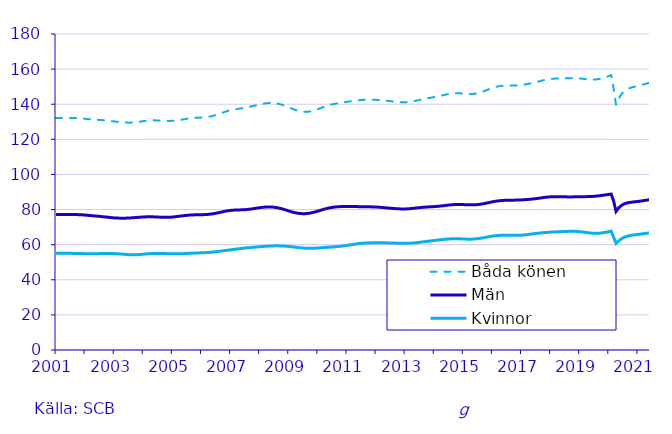
| Category | Båda könen | Män | Kvinnor |
|---|---|---|---|
| 2001.0 | 132.22 | 77.18 | 55.04 |
| nan | 132.19 | 77.15 | 55.04 |
| nan | 132.19 | 77.15 | 55.05 |
| nan | 132.18 | 77.14 | 55.04 |
| nan | 132.18 | 77.13 | 55.04 |
| nan | 132.17 | 77.13 | 55.04 |
| nan | 132.2 | 77.15 | 55.05 |
| nan | 132.19 | 77.15 | 55.03 |
| nan | 132.15 | 77.14 | 55.01 |
| nan | 132.08 | 77.11 | 54.98 |
| nan | 131.99 | 77.05 | 54.94 |
| nan | 131.87 | 76.97 | 54.91 |
| nan | 131.73 | 76.86 | 54.87 |
| nan | 131.58 | 76.73 | 54.85 |
| nan | 131.45 | 76.61 | 54.84 |
| nan | 131.32 | 76.48 | 54.84 |
| nan | 131.22 | 76.36 | 54.86 |
| nan | 131.12 | 76.23 | 54.88 |
| nan | 131.02 | 76.1 | 54.92 |
| nan | 130.93 | 75.97 | 54.96 |
| nan | 130.82 | 75.82 | 55 |
| nan | 130.7 | 75.67 | 55.02 |
| nan | 130.54 | 75.52 | 55.02 |
| nan | 130.37 | 75.38 | 54.99 |
| 2003.0 | 130.19 | 75.26 | 54.93 |
| nan | 130.02 | 75.16 | 54.85 |
| nan | 129.86 | 75.11 | 54.75 |
| nan | 129.73 | 75.08 | 54.64 |
| nan | 129.61 | 75.09 | 54.53 |
| nan | 129.54 | 75.12 | 54.41 |
| nan | 129.5 | 75.18 | 54.32 |
| nan | 129.53 | 75.26 | 54.26 |
| nan | 129.61 | 75.36 | 54.25 |
| nan | 129.75 | 75.47 | 54.28 |
| nan | 129.93 | 75.58 | 54.35 |
| nan | 130.13 | 75.68 | 54.45 |
| nan | 130.35 | 75.77 | 54.57 |
| nan | 130.54 | 75.84 | 54.69 |
| nan | 130.68 | 75.88 | 54.8 |
| nan | 130.77 | 75.88 | 54.89 |
| nan | 130.81 | 75.85 | 54.95 |
| nan | 130.8 | 75.8 | 55 |
| nan | 130.74 | 75.73 | 55.01 |
| nan | 130.66 | 75.66 | 54.99 |
| nan | 130.56 | 75.6 | 54.97 |
| nan | 130.48 | 75.56 | 54.93 |
| nan | 130.45 | 75.56 | 54.88 |
| nan | 130.46 | 75.62 | 54.85 |
| 2005.0 | 130.54 | 75.72 | 54.81 |
| nan | 130.66 | 75.87 | 54.8 |
| nan | 130.83 | 76.04 | 54.79 |
| nan | 131.03 | 76.22 | 54.81 |
| nan | 131.25 | 76.4 | 54.85 |
| nan | 131.48 | 76.57 | 54.91 |
| nan | 131.71 | 76.72 | 54.99 |
| nan | 131.91 | 76.84 | 55.07 |
| nan | 132.06 | 76.93 | 55.14 |
| nan | 132.18 | 76.98 | 55.2 |
| nan | 132.27 | 77.02 | 55.26 |
| nan | 132.35 | 77.04 | 55.31 |
| nan | 132.43 | 77.07 | 55.36 |
| nan | 132.53 | 77.11 | 55.42 |
| nan | 132.67 | 77.18 | 55.49 |
| nan | 132.87 | 77.29 | 55.58 |
| nan | 133.14 | 77.44 | 55.69 |
| nan | 133.48 | 77.65 | 55.83 |
| nan | 133.89 | 77.91 | 55.98 |
| nan | 134.36 | 78.2 | 56.16 |
| nan | 134.85 | 78.5 | 56.34 |
| nan | 135.34 | 78.81 | 56.53 |
| nan | 135.8 | 79.1 | 56.71 |
| nan | 136.22 | 79.34 | 56.88 |
| 2007.0 | 136.57 | 79.52 | 57.05 |
| nan | 136.87 | 79.64 | 57.23 |
| nan | 137.13 | 79.72 | 57.41 |
| nan | 137.36 | 79.77 | 57.59 |
| nan | 137.57 | 79.81 | 57.76 |
| nan | 137.79 | 79.86 | 57.93 |
| nan | 138.02 | 79.94 | 58.08 |
| nan | 138.27 | 80.06 | 58.22 |
| nan | 138.56 | 80.22 | 58.34 |
| nan | 138.88 | 80.41 | 58.47 |
| nan | 139.22 | 80.63 | 58.59 |
| nan | 139.56 | 80.86 | 58.71 |
| nan | 139.88 | 81.06 | 58.82 |
| nan | 140.16 | 81.24 | 58.93 |
| nan | 140.41 | 81.38 | 59.03 |
| nan | 140.6 | 81.47 | 59.13 |
| nan | 140.71 | 81.5 | 59.21 |
| nan | 140.72 | 81.45 | 59.27 |
| nan | 140.63 | 81.32 | 59.31 |
| nan | 140.44 | 81.11 | 59.32 |
| nan | 140.15 | 80.83 | 59.31 |
| nan | 139.76 | 80.49 | 59.27 |
| nan | 139.3 | 80.09 | 59.21 |
| nan | 138.77 | 79.66 | 59.12 |
| 2009.0 | 138.22 | 79.22 | 59 |
| nan | 137.65 | 78.79 | 58.86 |
| nan | 137.11 | 78.41 | 58.7 |
| nan | 136.61 | 78.09 | 58.52 |
| nan | 136.2 | 77.85 | 58.34 |
| nan | 135.89 | 77.71 | 58.19 |
| nan | 135.71 | 77.65 | 58.06 |
| nan | 135.65 | 77.68 | 57.96 |
| nan | 135.73 | 77.81 | 57.91 |
| nan | 135.94 | 78.03 | 57.91 |
| nan | 136.27 | 78.33 | 57.94 |
| nan | 136.69 | 78.69 | 58.01 |
| nan | 137.19 | 79.1 | 58.1 |
| nan | 137.73 | 79.53 | 58.2 |
| nan | 138.27 | 79.96 | 58.31 |
| nan | 138.77 | 80.35 | 58.42 |
| nan | 139.23 | 80.71 | 58.52 |
| nan | 139.62 | 81 | 58.62 |
| nan | 139.95 | 81.24 | 58.71 |
| nan | 140.24 | 81.43 | 58.81 |
| nan | 140.49 | 81.57 | 58.92 |
| nan | 140.71 | 81.66 | 59.05 |
| nan | 140.93 | 81.72 | 59.21 |
| nan | 141.14 | 81.74 | 59.4 |
| 2011.0 | 141.35 | 81.75 | 59.6 |
| nan | 141.55 | 81.74 | 59.81 |
| nan | 141.75 | 81.72 | 60.03 |
| nan | 141.95 | 81.7 | 60.25 |
| nan | 142.13 | 81.68 | 60.45 |
| nan | 142.29 | 81.66 | 60.63 |
| nan | 142.41 | 81.63 | 60.77 |
| nan | 142.5 | 81.61 | 60.88 |
| nan | 142.55 | 81.59 | 60.96 |
| nan | 142.58 | 81.56 | 61.01 |
| nan | 142.57 | 81.53 | 61.04 |
| nan | 142.53 | 81.48 | 61.06 |
| nan | 142.5 | 81.44 | 61.05 |
| nan | 142.41 | 81.35 | 61.06 |
| nan | 142.3 | 81.24 | 61.06 |
| nan | 142.17 | 81.12 | 61.05 |
| nan | 142.03 | 80.99 | 61.04 |
| nan | 141.88 | 80.87 | 61.01 |
| nan | 141.73 | 80.75 | 60.98 |
| nan | 141.57 | 80.64 | 60.94 |
| nan | 141.42 | 80.53 | 60.9 |
| nan | 141.3 | 80.44 | 60.86 |
| nan | 141.19 | 80.37 | 60.82 |
| nan | 141.13 | 80.33 | 60.8 |
| 2013.0 | 141.13 | 80.34 | 60.79 |
| nan | 141.21 | 80.41 | 60.8 |
| nan | 141.37 | 80.52 | 60.85 |
| nan | 141.58 | 80.65 | 60.93 |
| nan | 141.84 | 80.8 | 61.04 |
| nan | 142.14 | 80.96 | 61.18 |
| nan | 142.45 | 81.11 | 61.34 |
| nan | 142.75 | 81.24 | 61.51 |
| nan | 143.04 | 81.35 | 61.69 |
| nan | 143.31 | 81.45 | 61.86 |
| nan | 143.57 | 81.54 | 62.03 |
| nan | 143.82 | 81.61 | 62.21 |
| nan | 144.07 | 81.69 | 62.38 |
| nan | 144.33 | 81.78 | 62.55 |
| nan | 144.61 | 81.9 | 62.71 |
| nan | 144.91 | 82.05 | 62.86 |
| nan | 145.22 | 82.21 | 63.01 |
| nan | 145.53 | 82.39 | 63.14 |
| nan | 145.81 | 82.56 | 63.26 |
| nan | 146.05 | 82.7 | 63.35 |
| nan | 146.21 | 82.81 | 63.4 |
| nan | 146.28 | 82.87 | 63.41 |
| nan | 146.26 | 82.89 | 63.37 |
| nan | 146.19 | 82.87 | 63.32 |
| 2015.0 | 146.08 | 82.83 | 63.25 |
| nan | 145.96 | 82.77 | 63.18 |
| nan | 145.86 | 82.72 | 63.14 |
| nan | 145.82 | 82.69 | 63.14 |
| nan | 145.88 | 82.69 | 63.19 |
| nan | 146.04 | 82.74 | 63.29 |
| nan | 146.29 | 82.85 | 63.45 |
| nan | 146.65 | 83.01 | 63.64 |
| nan | 147.12 | 83.24 | 63.88 |
| nan | 147.65 | 83.52 | 64.14 |
| nan | 148.22 | 83.82 | 64.4 |
| nan | 148.77 | 84.12 | 64.65 |
| nan | 149.28 | 84.4 | 64.87 |
| nan | 149.71 | 84.65 | 65.06 |
| nan | 150.06 | 84.87 | 65.19 |
| nan | 150.31 | 85.03 | 65.29 |
| nan | 150.49 | 85.15 | 65.34 |
| nan | 150.6 | 85.24 | 65.36 |
| nan | 150.64 | 85.29 | 65.36 |
| nan | 150.66 | 85.32 | 65.34 |
| nan | 150.66 | 85.34 | 65.32 |
| nan | 150.67 | 85.36 | 65.31 |
| nan | 150.72 | 85.4 | 65.32 |
| nan | 150.81 | 85.45 | 65.36 |
| 2017.0 | 150.94 | 85.51 | 65.43 |
| nan | 151.13 | 85.59 | 65.54 |
| nan | 151.38 | 85.69 | 65.69 |
| nan | 151.66 | 85.8 | 65.86 |
| nan | 151.96 | 85.92 | 66.04 |
| nan | 152.27 | 86.06 | 66.21 |
| nan | 152.6 | 86.23 | 66.38 |
| nan | 152.95 | 86.42 | 66.53 |
| nan | 153.3 | 86.62 | 66.68 |
| nan | 153.64 | 86.83 | 66.81 |
| nan | 153.94 | 87.01 | 66.93 |
| nan | 154.2 | 87.15 | 67.05 |
| nan | 154.4 | 87.26 | 67.14 |
| nan | 154.52 | 87.31 | 67.21 |
| nan | 154.6 | 87.33 | 67.28 |
| nan | 154.65 | 87.31 | 67.34 |
| nan | 154.68 | 87.29 | 67.4 |
| nan | 154.71 | 87.26 | 67.45 |
| nan | 154.74 | 87.23 | 67.51 |
| nan | 154.77 | 87.22 | 67.56 |
| nan | 154.8 | 87.21 | 67.59 |
| nan | 154.82 | 87.22 | 67.6 |
| nan | 154.81 | 87.23 | 67.58 |
| nan | 154.75 | 87.24 | 67.51 |
| 2019.0 | 154.67 | 87.26 | 67.4 |
| nan | 154.55 | 87.29 | 67.26 |
| nan | 154.41 | 87.33 | 67.08 |
| nan | 154.27 | 87.37 | 66.89 |
| nan | 154.13 | 87.42 | 66.71 |
| nan | 154.04 | 87.47 | 66.57 |
| nan | 154.05 | 87.56 | 66.49 |
| nan | 154.16 | 87.68 | 66.47 |
| nan | 154.38 | 87.84 | 66.53 |
| nan | 154.69 | 88.02 | 66.67 |
| nan | 155.09 | 88.22 | 66.87 |
| nan | 155.55 | 88.43 | 67.12 |
| nan | 156.05 | 88.64 | 67.41 |
| nan | 156.55 | 88.82 | 67.73 |
| nan | 149 | 84.84 | 64.17 |
| nan | 139.67 | 78.95 | 60.72 |
| nan | 142.95 | 80.83 | 62.12 |
| nan | 145.28 | 82.12 | 63.16 |
| nan | 146.92 | 82.99 | 63.93 |
| nan | 148.05 | 83.55 | 64.5 |
| nan | 148.83 | 83.9 | 64.93 |
| nan | 149.38 | 84.13 | 65.24 |
| nan | 149.78 | 84.3 | 65.48 |
| nan | 150.13 | 84.46 | 65.67 |
| 2021.0 | 150.46 | 84.62 | 65.84 |
| nan | 150.81 | 84.81 | 66 |
| nan | 151.17 | 85.01 | 66.17 |
| nan | 151.55 | 85.22 | 66.35 |
| nan | 151.95 | 85.44 | 66.54 |
| nan | 152.35 | 85.66 | 66.72 |